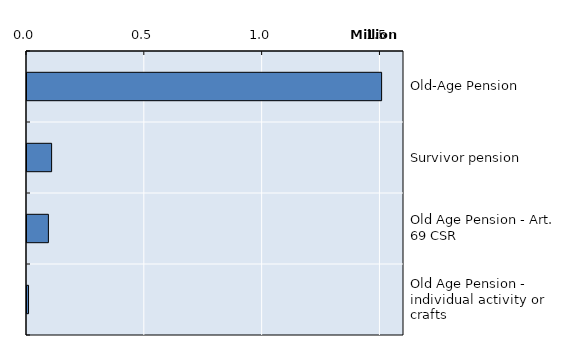
| Category | Series 0 |
|---|---|
| Old-Age Pension | 1505017 |
| Survivor pension | 104493 |
| Old Age Pension - Art. 69 CSR | 90797 |
| Old Age Pension - individual activity or crafts | 6550 |